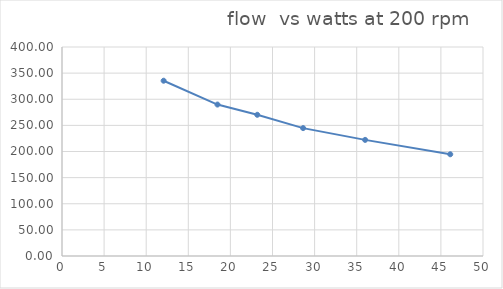
| Category | flow |
|---|---|
| 12.07 | 335.458 |
| 18.465 | 289.855 |
| 23.19 | 270.27 |
| 28.635 | 244.768 |
| 36.0 | 222.222 |
| 46.11 | 194.704 |